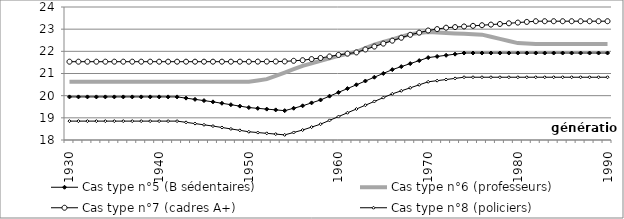
| Category | Cas type n°5 (B sédentaires) | Cas type n°6 (professeurs) | Cas type n°7 (cadres A+) | Cas type n°8 (policiers) |
|---|---|---|---|---|
| 1930.0 | 19.945 | 20.632 | 21.533 | 18.852 |
| 1931.0 | 19.945 | 20.632 | 21.533 | 18.852 |
| 1932.0 | 19.945 | 20.632 | 21.533 | 18.852 |
| 1933.0 | 19.945 | 20.632 | 21.533 | 18.852 |
| 1934.0 | 19.945 | 20.632 | 21.533 | 18.852 |
| 1935.0 | 19.945 | 20.632 | 21.533 | 18.852 |
| 1936.0 | 19.945 | 20.632 | 21.533 | 18.852 |
| 1937.0 | 19.945 | 20.632 | 21.533 | 18.852 |
| 1938.0 | 19.945 | 20.632 | 21.533 | 18.852 |
| 1939.0 | 19.945 | 20.632 | 21.533 | 18.852 |
| 1940.0 | 19.945 | 20.632 | 21.533 | 18.852 |
| 1941.0 | 19.945 | 20.632 | 21.533 | 18.852 |
| 1942.0 | 19.945 | 20.632 | 21.533 | 18.852 |
| 1943.0 | 19.889 | 20.632 | 21.533 | 18.796 |
| 1944.0 | 19.833 | 20.632 | 21.533 | 18.74 |
| 1945.0 | 19.777 | 20.632 | 21.533 | 18.685 |
| 1946.0 | 19.721 | 20.632 | 21.533 | 18.629 |
| 1947.0 | 19.657 | 20.632 | 21.533 | 18.564 |
| 1948.0 | 19.593 | 20.632 | 21.533 | 18.5 |
| 1949.0 | 19.528 | 20.632 | 21.533 | 18.436 |
| 1950.0 | 19.464 | 20.632 | 21.533 | 18.371 |
| 1951.0 | 19.429 | 20.689 | 21.536 | 18.336 |
| 1952.0 | 19.394 | 20.745 | 21.539 | 18.301 |
| 1953.0 | 19.358 | 20.894 | 21.542 | 18.266 |
| 1954.0 | 19.323 | 21.043 | 21.545 | 18.231 |
| 1955.0 | 19.433 | 21.192 | 21.572 | 18.34 |
| 1956.0 | 19.542 | 21.341 | 21.6 | 18.45 |
| 1957.0 | 19.675 | 21.457 | 21.65 | 18.582 |
| 1958.0 | 19.807 | 21.573 | 21.7 | 18.715 |
| 1959.0 | 19.978 | 21.685 | 21.769 | 18.886 |
| 1960.0 | 20.149 | 21.796 | 21.837 | 19.056 |
| 1961.0 | 20.32 | 21.887 | 21.895 | 19.227 |
| 1962.0 | 20.491 | 21.979 | 21.952 | 19.398 |
| 1963.0 | 20.662 | 22.143 | 22.084 | 19.569 |
| 1964.0 | 20.833 | 22.307 | 22.216 | 19.74 |
| 1965.0 | 21.004 | 22.424 | 22.348 | 19.911 |
| 1966.0 | 21.175 | 22.541 | 22.481 | 20.082 |
| 1967.0 | 21.31 | 22.658 | 22.613 | 20.218 |
| 1968.0 | 21.446 | 22.775 | 22.745 | 20.354 |
| 1969.0 | 21.582 | 22.823 | 22.843 | 20.489 |
| 1970.0 | 21.718 | 22.871 | 22.94 | 20.625 |
| 1971.0 | 21.769 | 22.848 | 23.003 | 20.677 |
| 1972.0 | 21.821 | 22.825 | 23.066 | 20.728 |
| 1973.0 | 21.873 | 22.807 | 23.094 | 20.78 |
| 1974.0 | 21.924 | 22.789 | 23.122 | 20.832 |
| 1975.0 | 21.924 | 22.771 | 23.15 | 20.832 |
| 1976.0 | 21.924 | 22.754 | 23.178 | 20.832 |
| 1977.0 | 21.924 | 22.658 | 23.206 | 20.832 |
| 1978.0 | 21.924 | 22.562 | 23.234 | 20.832 |
| 1979.0 | 21.924 | 22.467 | 23.265 | 20.832 |
| 1980.0 | 21.924 | 22.371 | 23.296 | 20.832 |
| 1981.0 | 21.924 | 22.352 | 23.328 | 20.832 |
| 1982.0 | 21.924 | 22.333 | 23.359 | 20.832 |
| 1983.0 | 21.924 | 22.333 | 23.359 | 20.832 |
| 1984.0 | 21.924 | 22.333 | 23.359 | 20.832 |
| 1985.0 | 21.924 | 22.333 | 23.359 | 20.832 |
| 1986.0 | 21.924 | 22.333 | 23.359 | 20.832 |
| 1987.0 | 21.924 | 22.333 | 23.359 | 20.832 |
| 1988.0 | 21.924 | 22.333 | 23.359 | 20.832 |
| 1989.0 | 21.924 | 22.333 | 23.359 | 20.832 |
| 1990.0 | 21.924 | 22.333 | 23.359 | 20.832 |